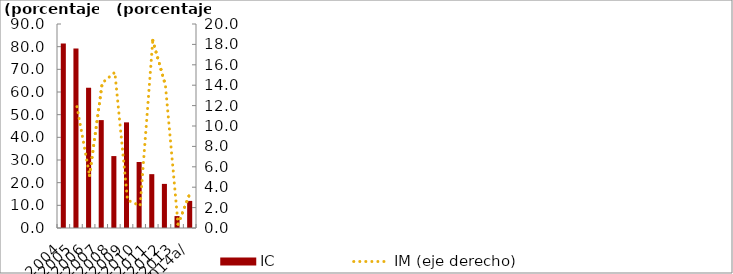
| Category | IC |
|---|---|
| 2004 | 81.447 |
| 2005 | 79.207 |
| 2006 | 61.83 |
| 2007 | 47.603 |
| 2008 | 31.733 |
| 2009 | 46.604 |
| 2010 | 29.11 |
| 2011 | 23.754 |
| 2012 | 19.46 |
| 2013 | 5.258 |
| 2014a/ | 11.955 |